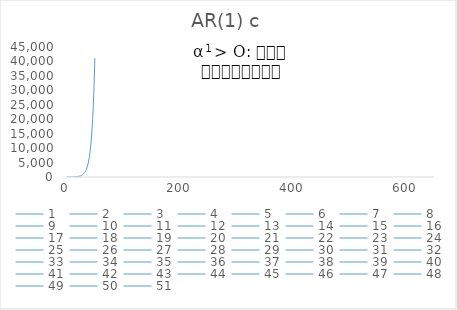
| Category | AR(1) c |
|---|---|
| 0 | 0 |
| 1 | 1.015 |
| 2 | 2.797 |
| 3 | 3.376 |
| 4 | 4.193 |
| 5 | 5.211 |
| 6 | 7.448 |
| 7 | 11.686 |
| 8 | 15.06 |
| 9 | 18.181 |
| 10 | 21.77 |
| 11 | 27.835 |
| 12 | 34.348 |
| 13 | 43.652 |
| 14 | 52.174 |
| 15 | 63.893 |
| 16 | 77.297 |
| 17 | 93.878 |
| 18 | 114.458 |
| 19 | 139.331 |
| 20 | 167.097 |
| 21 | 201.745 |
| 22 | 244.597 |
| 23 | 295.485 |
| 24 | 355.087 |
| 25 | 426.353 |
| 26 | 512.919 |
| 27 | 616.253 |
| 28 | 739.775 |
| 29 | 888.713 |
| 30 | 1066.999 |
| 31 | 1282.572 |
| 32 | 1539.317 |
| 33 | 1849.243 |
| 34 | 2218.827 |
| 35 | 2664.392 |
| 36 | 3198.001 |
| 37 | 3838.709 |
| 38 | 4607.962 |
| 39 | 5529.754 |
| 40 | 6637.367 |
| 41 | 7965.93 |
| 42 | 9561.24 |
| 43 | 11475.111 |
| 44 | 13769.554 |
| 45 | 16523.957 |
| 46 | 19830.36 |
| 47 | 23798.317 |
| 48 | 28558.996 |
| 49 | 34272.111 |
| 50 | 41127.298 |